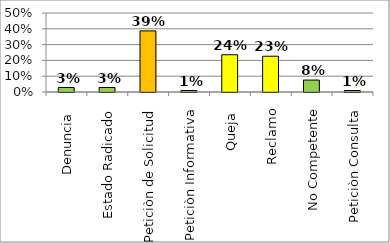
| Category | Series 0 |
|---|---|
| Denuncia  | 0.028 |
| Estado Radicado | 0.028 |
| Peticiòn de Solicitud | 0.387 |
| Peticiòn Informativa | 0.009 |
| Queja  | 0.236 |
| Reclamo | 0.226 |
| No Competente | 0.075 |
| Peticiòn Consulta | 0.009 |